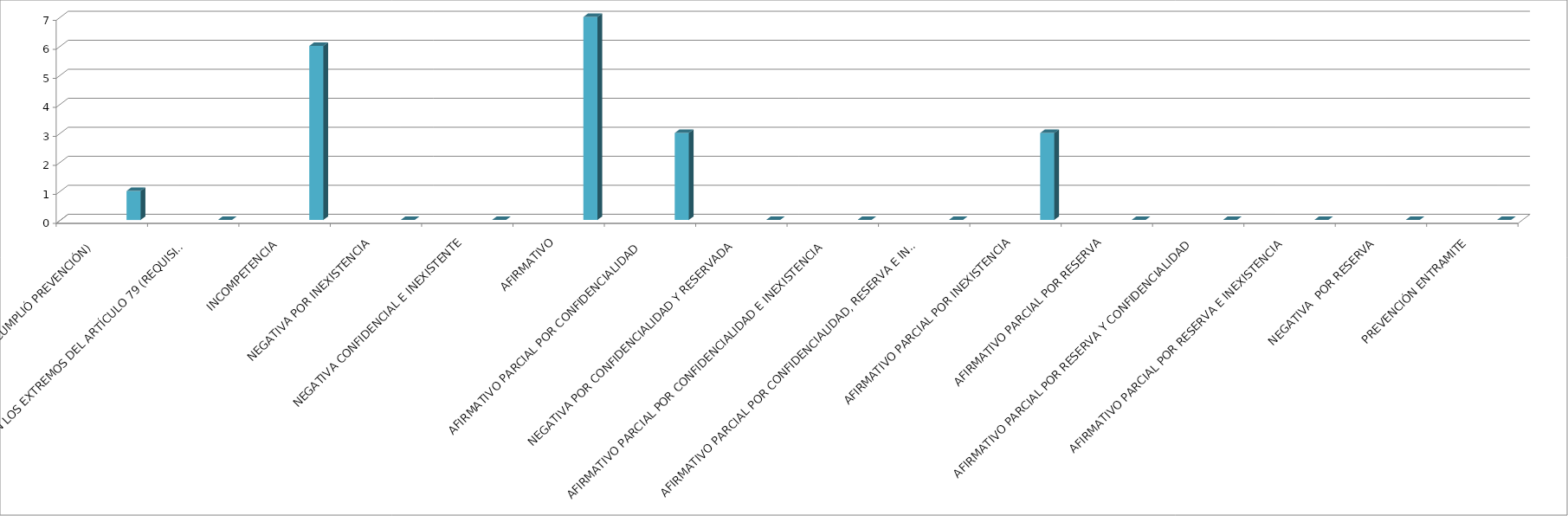
| Category | Series 0 | Series 1 | Series 2 | Series 3 | Series 4 |
|---|---|---|---|---|---|
| SE TIENE POR NO PRESENTADA ( NO CUMPLIÓ PREVENCIÓN) |  |  |  |  | 1 |
| NO CUMPLIO CON LOS EXTREMOS DEL ARTÍCULO 79 (REQUISITOS) |  |  |  |  | 0 |
| INCOMPETENCIA  |  |  |  |  | 6 |
| NEGATIVA POR INEXISTENCIA |  |  |  |  | 0 |
| NEGATIVA CONFIDENCIAL E INEXISTENTE |  |  |  |  | 0 |
| AFIRMATIVO |  |  |  |  | 7 |
| AFIRMATIVO PARCIAL POR CONFIDENCIALIDAD  |  |  |  |  | 3 |
| NEGATIVA POR CONFIDENCIALIDAD Y RESERVADA |  |  |  |  | 0 |
| AFIRMATIVO PARCIAL POR CONFIDENCIALIDAD E INEXISTENCIA |  |  |  |  | 0 |
| AFIRMATIVO PARCIAL POR CONFIDENCIALIDAD, RESERVA E INEXISTENCIA |  |  |  |  | 0 |
| AFIRMATIVO PARCIAL POR INEXISTENCIA |  |  |  |  | 3 |
| AFIRMATIVO PARCIAL POR RESERVA |  |  |  |  | 0 |
| AFIRMATIVO PARCIAL POR RESERVA Y CONFIDENCIALIDAD |  |  |  |  | 0 |
| AFIRMATIVO PARCIAL POR RESERVA E INEXISTENCIA |  |  |  |  | 0 |
| NEGATIVA  POR RESERVA |  |  |  |  | 0 |
| PREVENCIÓN ENTRAMITE |  |  |  |  | 0 |